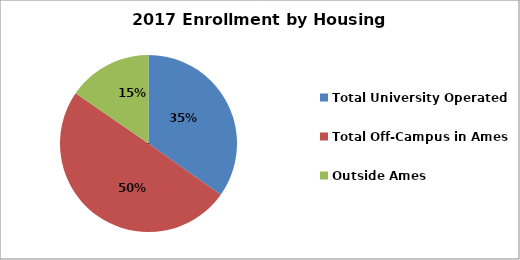
| Category | Series 0 |
|---|---|
| Total University Operated | 0.339 |
| Total Off-Campus in Ames | 0.485 |
| Outside Ames | 0.15 |